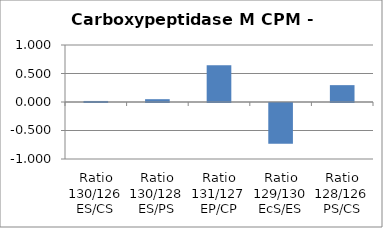
| Category | Carboxypeptidase M CPM - [CBPM_HUMAN] |
|---|---|
| Ratio 130/126 ES/CS | 0.018 |
| Ratio 130/128 ES/PS | 0.049 |
| Ratio 131/127 EP/CP | 0.643 |
| Ratio 129/130 EcS/ES | -0.715 |
| Ratio 128/126 PS/CS | 0.296 |